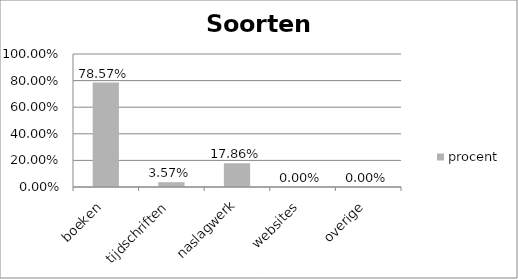
| Category | procent |
|---|---|
| boeken | 0.786 |
| tijdschriften | 0.036 |
| naslagwerk | 0.179 |
| websites | 0 |
| overige | 0 |